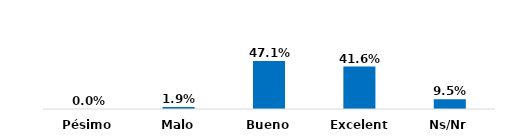
| Category | Series 0 |
|---|---|
| Pésimo | 0 |
| Malo | 0.019 |
| Bueno | 0.471 |
| Excelente | 0.416 |
| Ns/Nr | 0.095 |